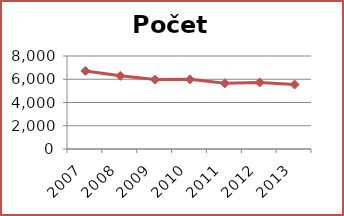
| Category | Počet čtenářů |
|---|---|
| 2007.0 | 6719 |
| 2008.0 | 6293 |
| 2009.0 | 5970 |
| 2010.0 | 5992 |
| 2011.0 | 5653 |
| 2012.0 | 5728 |
| 2013.0 | 5547 |